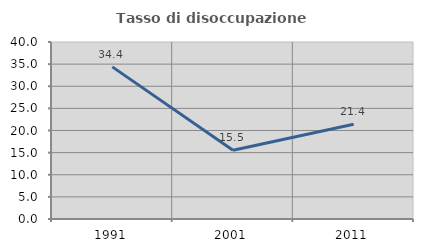
| Category | Tasso di disoccupazione giovanile  |
|---|---|
| 1991.0 | 34.375 |
| 2001.0 | 15.517 |
| 2011.0 | 21.429 |